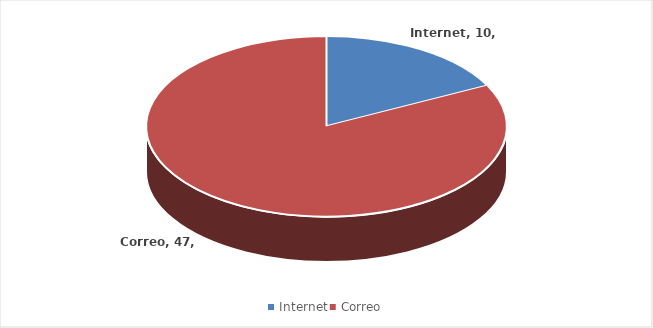
| Category | Series 0 |
|---|---|
| Internet | 10 |
| Correo | 47 |